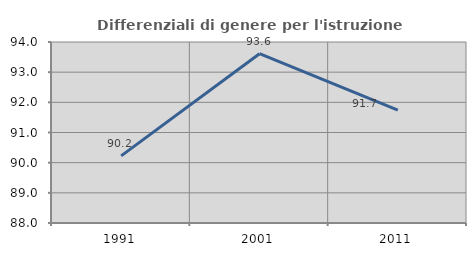
| Category | Differenziali di genere per l'istruzione superiore |
|---|---|
| 1991.0 | 90.225 |
| 2001.0 | 93.612 |
| 2011.0 | 91.744 |